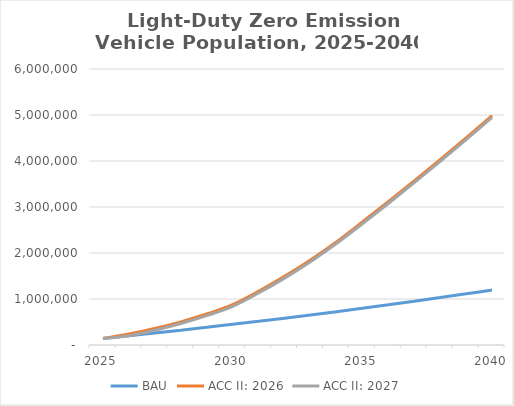
| Category | BAU | ACC II: 2026 | ACC II: 2027 |
|---|---|---|---|
| 2025.0 | 142376.916 | 142376.916 | 142376.916 |
| 2026.0 | 201135.222 | 238029.973 | 201135.222 |
| 2027.0 | 261163.948 | 358087.423 | 321192.673 |
| 2028.0 | 322453.69 | 503472.394 | 466577.644 |
| 2029.0 | 384995.048 | 675097.516 | 638202.766 |
| 2030.0 | 448778.619 | 876831.601 | 839936.851 |
| 2031.0 | 514595.207 | 1167649.08 | 1130754.33 |
| 2032.0 | 582454.718 | 1491165.353 | 1454270.603 |
| 2033.0 | 652367.06 | 1848856.405 | 1811961.655 |
| 2034.0 | 724342.14 | 2242208.589 | 2205313.839 |
| 2035.0 | 798389.866 | 2672718.626 | 2635823.876 |
| 2036.0 | 874260.235 | 3113825.421 | 3076930.671 |
| 2037.0 | 951953.246 | 3565528.974 | 3528634.223 |
| 2038.0 | 1031468.899 | 4027829.283 | 3990934.533 |
| 2039.0 | 1112807.195 | 4500726.351 | 4463831.6 |
| 2040.0 | 1195968.133 | 4984220.176 | 4947325.425 |